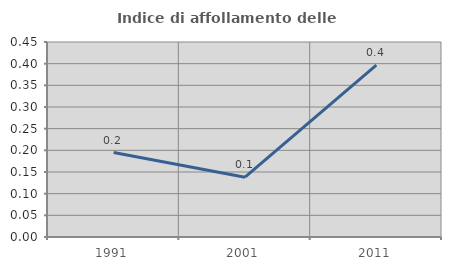
| Category | Indice di affollamento delle abitazioni  |
|---|---|
| 1991.0 | 0.195 |
| 2001.0 | 0.138 |
| 2011.0 | 0.397 |